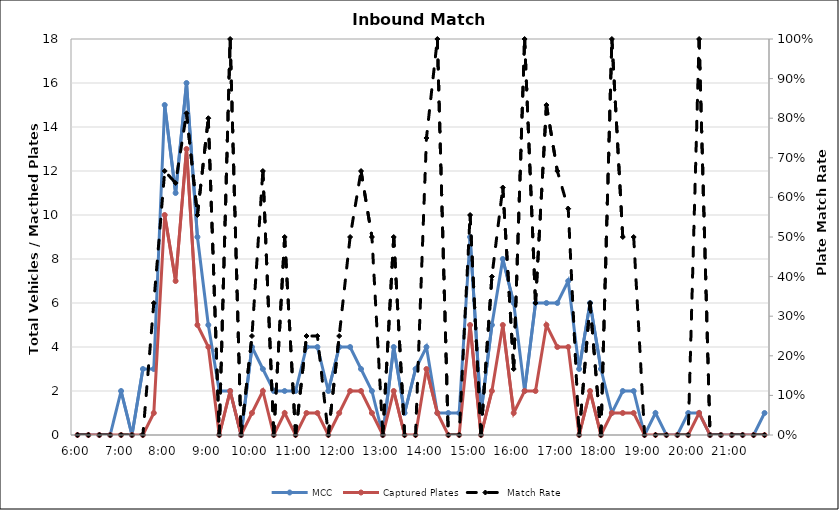
| Category | MCC | Captured Plates |
|---|---|---|
| 0.25 | 0 | 0 |
| 0.260416666666667 | 0 | 0 |
| 0.270833333333333 | 0 | 0 |
| 0.28125 | 0 | 0 |
| 0.291666666666667 | 2 | 0 |
| 0.302083333333333 | 0 | 0 |
| 0.3125 | 3 | 0 |
| 0.322916666666667 | 3 | 1 |
| 0.333333333333333 | 15 | 10 |
| 0.34375 | 11 | 7 |
| 0.354166666666667 | 16 | 13 |
| 0.364583333333333 | 9 | 5 |
| 0.375 | 5 | 4 |
| 0.385416666666667 | 2 | 0 |
| 0.395833333333333 | 2 | 2 |
| 0.40625 | 0 | 0 |
| 0.416666666666667 | 4 | 1 |
| 0.427083333333333 | 3 | 2 |
| 0.4375 | 2 | 0 |
| 0.447916666666667 | 2 | 1 |
| 0.458333333333333 | 2 | 0 |
| 0.46875 | 4 | 1 |
| 0.479166666666667 | 4 | 1 |
| 0.489583333333333 | 2 | 0 |
| 0.5 | 4 | 1 |
| 0.510416666666667 | 4 | 2 |
| 0.520833333333333 | 3 | 2 |
| 0.53125 | 2 | 1 |
| 0.541666666666667 | 0 | 0 |
| 0.552083333333333 | 4 | 2 |
| 0.5625 | 1 | 0 |
| 0.572916666666667 | 3 | 0 |
| 0.583333333333333 | 4 | 3 |
| 0.59375 | 1 | 1 |
| 0.604166666666667 | 1 | 0 |
| 0.614583333333333 | 1 | 0 |
| 0.625 | 9 | 5 |
| 0.635416666666667 | 1 | 0 |
| 0.645833333333333 | 5 | 2 |
| 0.65625 | 8 | 5 |
| 0.666666666666667 | 6 | 1 |
| 0.677083333333333 | 2 | 2 |
| 0.6875 | 6 | 2 |
| 0.697916666666667 | 6 | 5 |
| 0.708333333333333 | 6 | 4 |
| 0.71875 | 7 | 4 |
| 0.729166666666667 | 3 | 0 |
| 0.739583333333333 | 6 | 2 |
| 0.75 | 3 | 0 |
| 0.760416666666667 | 1 | 1 |
| 0.770833333333333 | 2 | 1 |
| 0.78125 | 2 | 1 |
| 0.791666666666667 | 0 | 0 |
| 0.802083333333333 | 1 | 0 |
| 0.8125 | 0 | 0 |
| 0.822916666666667 | 0 | 0 |
| 0.833333333333333 | 1 | 0 |
| 0.84375 | 1 | 1 |
| 0.854166666666667 | 0 | 0 |
| 0.864583333333333 | 0 | 0 |
| 0.875 | 0 | 0 |
| 0.885416666666667 | 0 | 0 |
| 0.895833333333333 | 0 | 0 |
| 0.90625 | 1 | 0 |